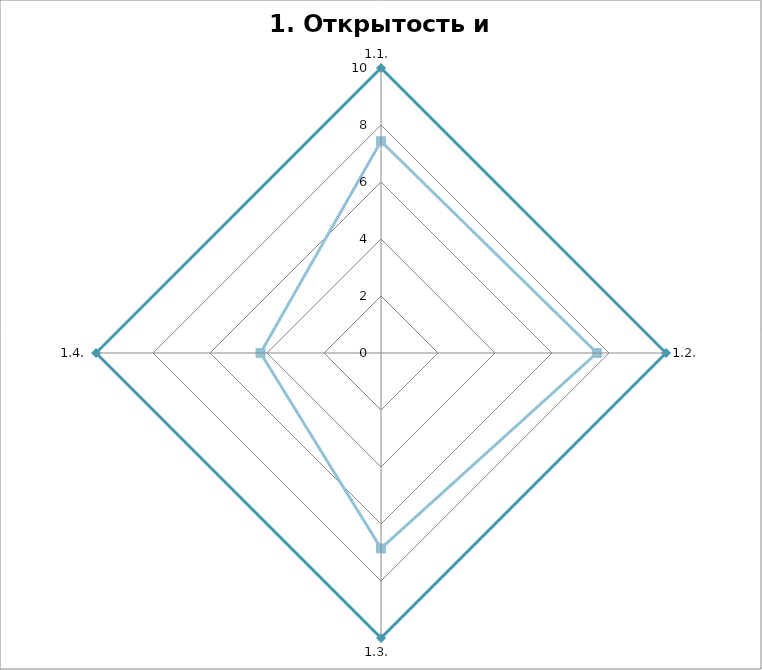
| Category | Series 0 | Series 1 |
|---|---|---|
| 1.1.  | 10 | 7.429 |
| 1.2. | 10 | 7.575 |
| 1.3.  | 10 | 6.856 |
| 1.4. | 10 | 4.227 |